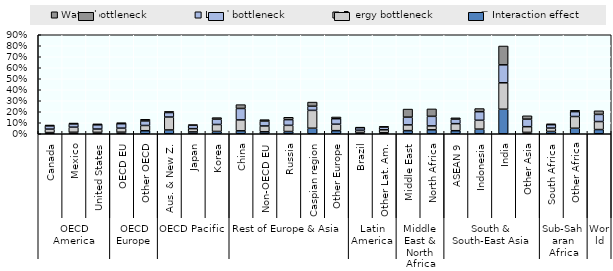
| Category | Interaction effect | Energy bottleneck | Land bottleneck | Water bottleneck |
|---|---|---|---|---|
| 0 | 0.011 | 0.032 | 0.029 | 0.008 |
| 1 | 0.014 | 0.046 | 0.03 | 0.008 |
| 2 | 0.012 | 0.03 | 0.038 | 0.009 |
| 3 | 0.014 | 0.037 | 0.04 | 0.01 |
| 4 | 0.027 | 0.048 | 0.041 | 0.015 |
| 5 | 0.034 | 0.118 | 0.041 | 0.011 |
| 6 | 0.017 | 0.03 | 0.031 | 0.006 |
| 7 | 0.021 | 0.063 | 0.048 | 0.014 |
| 8 | 0.027 | 0.099 | 0.104 | 0.035 |
| 9 | 0.018 | 0.053 | 0.045 | 0.013 |
| 10 | 0.02 | 0.056 | 0.052 | 0.021 |
| 11 | 0.05 | 0.162 | 0.038 | 0.038 |
| 12 | 0.028 | 0.059 | 0.05 | 0.016 |
| 13 | 0.011 | 0.021 | 0.023 | 0.005 |
| 14 | 0.01 | 0.026 | 0.024 | 0.007 |
| 15 | 0.028 | 0.052 | 0.07 | 0.073 |
| 16 | 0.036 | 0.036 | 0.087 | 0.067 |
| 17 | 0.028 | 0.064 | 0.041 | 0.013 |
| 18 | 0.042 | 0.081 | 0.078 | 0.028 |
| 19 | 0.223 | 0.24 | 0.163 | 0.171 |
| 20 | 0.012 | 0.052 | 0.069 | 0.031 |
| 21 | 0.021 | 0.031 | 0.031 | 0.008 |
| 22 | 0.05 | 0.107 | 0.044 | 0.012 |
| 23 | 0.038 | 0.073 | 0.065 | 0.033 |